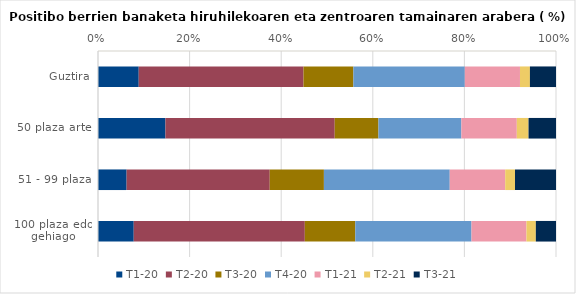
| Category | T1-20 | T2-20 | T3-20 | T4-20 | T1-21 | T2-21 | T3-21 |
|---|---|---|---|---|---|---|---|
| Guztira | 8.893 | 35.979 | 10.887 | 24.329 | 12.045 | 2.173 | 5.694 |
| 50 plaza arte | 14.726 | 36.962 | 9.546 | 18.102 | 12.107 | 2.561 | 5.995 |
| 51 - 99 plaza | 6.25 | 31.25 | 11.824 | 27.477 | 12.106 | 2.14 | 8.953 |
| 100 plaza edo gehiago | 7.803 | 37.354 | 11.018 | 25.374 | 12.001 | 2.048 | 4.403 |